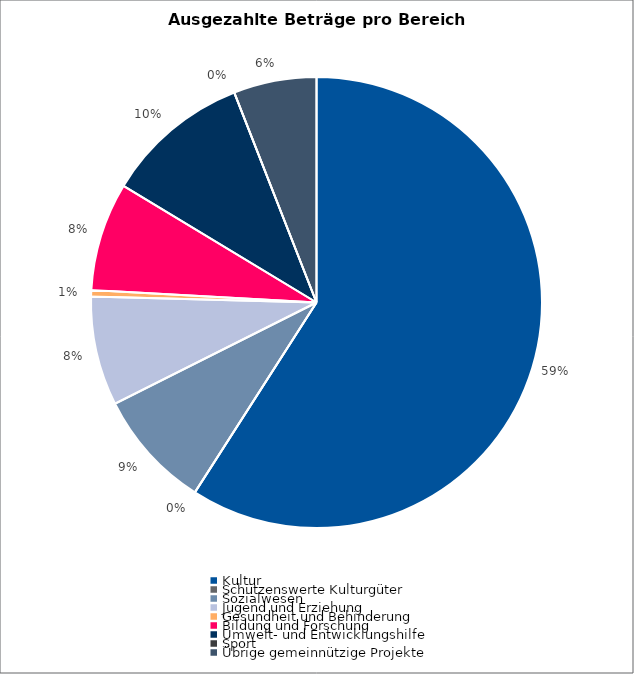
| Category | Series 0 |
|---|---|
| Kultur | 4619900 |
| Schützenswerte Kulturgüter | 0 |
| Sozialwesen | 666600 |
| Jugend und Erziehung | 612400 |
| Gesundheit und Behinderung | 36000 |
| Bildung und Forschung | 607800 |
| Umwelt- und Entwicklungshilfe | 814000 |
| Sport | 0 |
| Übrige gemeinnützige Projekte | 465000 |